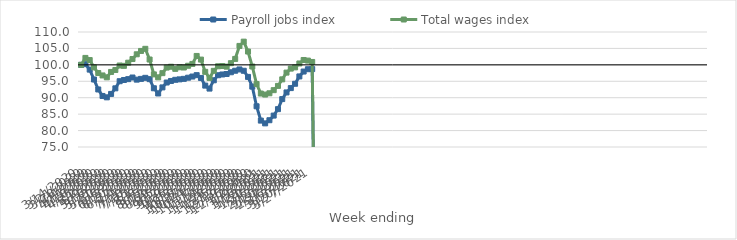
| Category | Payroll jobs index | Total wages index |
|---|---|---|
| 14/03/2020 | 100 | 100 |
| 21/03/2020 | 100.207 | 102.114 |
| 28/03/2020 | 98.551 | 101.462 |
| 04/04/2020 | 95.54 | 99.238 |
| 11/04/2020 | 92.511 | 97.511 |
| 18/04/2020 | 90.533 | 96.776 |
| 25/04/2020 | 90.115 | 96.208 |
| 02/05/2020 | 91.154 | 97.845 |
| 09/05/2020 | 92.856 | 98.44 |
| 16/05/2020 | 95.024 | 99.796 |
| 23/05/2020 | 95.395 | 99.698 |
| 30/05/2020 | 95.652 | 100.66 |
| 06/06/2020 | 96.151 | 101.777 |
| 13/06/2020 | 95.503 | 103.216 |
| 20/06/2020 | 95.732 | 104.234 |
| 27/06/2020 | 96.048 | 104.88 |
| 04/07/2020 | 95.651 | 101.622 |
| 11/07/2020 | 92.874 | 97.096 |
| 18/07/2020 | 91.283 | 96.198 |
| 25/07/2020 | 93.137 | 97.478 |
| 01/08/2020 | 94.624 | 99.167 |
| 08/08/2020 | 95.101 | 99.431 |
| 15/08/2020 | 95.451 | 98.784 |
| 22/08/2020 | 95.582 | 99.269 |
| 29/08/2020 | 95.741 | 99.19 |
| 05/09/2020 | 96.088 | 99.725 |
| 12/09/2020 | 96.446 | 100.287 |
| 19/09/2020 | 96.866 | 102.713 |
| 26/09/2020 | 96.016 | 101.606 |
| 03/10/2020 | 93.681 | 97.875 |
| 10/10/2020 | 92.779 | 96.033 |
| 17/10/2020 | 95.305 | 98.179 |
| 24/10/2020 | 96.845 | 99.569 |
| 31/10/2020 | 97.07 | 99.648 |
| 07/11/2020 | 97.214 | 99.453 |
| 14/11/2020 | 97.749 | 100.511 |
| 21/11/2020 | 98.211 | 101.811 |
| 28/11/2020 | 98.609 | 105.764 |
| 05/12/2020 | 98.201 | 107.065 |
| 12/12/2020 | 96.338 | 104.054 |
| 19/12/2020 | 93.373 | 99.498 |
| 26/12/2020 | 87.391 | 94.175 |
| 02/01/2021 | 83.034 | 91.271 |
| 09/01/2021 | 82.194 | 90.957 |
| 16/01/2021 | 83.148 | 91.35 |
| 23/01/2021 | 84.559 | 92.299 |
| 30/01/2021 | 86.522 | 93.598 |
| 06/02/2021 | 89.584 | 95.591 |
| 13/02/2021 | 91.607 | 97.643 |
| 20/02/2021 | 92.927 | 98.855 |
| 27/02/2021 | 94.247 | 99.238 |
| 06/03/2021 | 96.476 | 100.424 |
| 13/03/2021 | 97.965 | 101.481 |
| 20/03/2021 | 98.674 | 101.3 |
| 27/03/2021 | 98.707 | 100.881 |